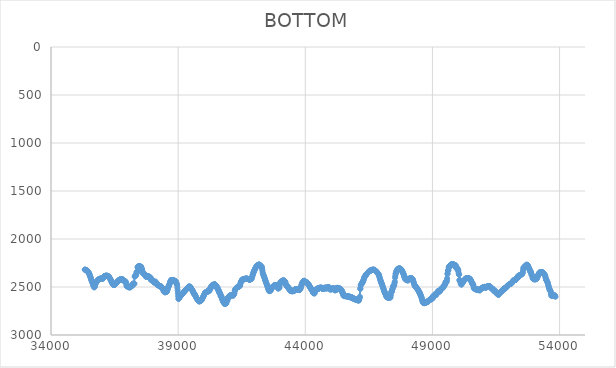
| Category | BOTTOM |
|---|---|
| 35327.6569 | 2318.68 |
| 35334.7907 | 2319.68 |
| 35345.0303 | 2320.68 |
| 35355.2703 | 2321.69 |
| 35365.5104 | 2322.69 |
| 35375.7505 | 2323.7 |
| 35385.9906 | 2324.7 |
| 35396.2307 | 2325.72 |
| 35406.4708 | 2327.69 |
| 35416.7108 | 2329.66 |
| 35426.9509 | 2331.63 |
| 35437.191 | 2333.6 |
| 35447.4311 | 2335.6 |
| 35457.6712 | 2340.18 |
| 35467.9113 | 2344.75 |
| 35478.1514 | 2349.33 |
| 35488.3914 | 2353.92 |
| 35498.6315 | 2360.02 |
| 35508.8716 | 2366.12 |
| 35519.1117 | 2372.23 |
| 35529.3518 | 2379.98 |
| 35539.5919 | 2387.72 |
| 35549.8319 | 2395.46 |
| 35560.072 | 2403.22 |
| 35570.3121 | 2412.37 |
| 35580.5522 | 2421.5 |
| 35590.7923 | 2429.24 |
| 35601.0324 | 2436.97 |
| 35611.2724 | 2443.3 |
| 35621.5125 | 2449.64 |
| 35631.7526 | 2455.97 |
| 35641.9927 | 2462.35 |
| 35652.2328 | 2472.2 |
| 35662.4729 | 2482.02 |
| 35672.713 | 2489.06 |
| 35682.953 | 2496.07 |
| 35693.1931 | 2500.29 |
| 35703.4332 | 2504.4 |
| 35713.6733 | 2498.77 |
| 35723.9134 | 2493.1 |
| 35734.1535 | 2483.18 |
| 35744.3935 | 2467.81 |
| 35754.6336 | 2462.17 |
| 35764.8737 | 2456.59 |
| 35775.1138 | 2455.12 |
| 35785.3539 | 2448.1 |
| 35795.594 | 2442.49 |
| 35805.8341 | 2439.21 |
| 35816.0741 | 2435.92 |
| 35826.3142 | 2432.65 |
| 35836.5543 | 2429.83 |
| 35846.7944 | 2427.02 |
| 35857.0345 | 2424.21 |
| 35867.2746 | 2422.33 |
| 35877.5146 | 2420.46 |
| 35887.7547 | 2418.59 |
| 35897.9948 | 2417.89 |
| 35908.2349 | 2417.19 |
| 35918.475 | 2416.48 |
| 35928.7151 | 2415.76 |
| 35938.9552 | 2413.89 |
| 35949.1952 | 2412.01 |
| 35959.4353 | 2410.17 |
| 35969.6754 | 2411.1 |
| 35979.9155 | 2412.04 |
| 35990.1556 | 2412.97 |
| 36000.3957 | 2412.97 |
| 36010.6357 | 2412.97 |
| 36020.8758 | 2412.97 |
| 36031.1159 | 2412.97 |
| 36041.356 | 2412.89 |
| 36051.5961 | 2405.85 |
| 36061.8362 | 2398.86 |
| 36072.0763 | 2396.05 |
| 36082.3163 | 2393.23 |
| 36092.5564 | 2390.42 |
| 36102.7965 | 2387.6 |
| 36113.0366 | 2384.81 |
| 36123.2767 | 2384.46 |
| 36133.5168 | 2384.11 |
| 36143.7568 | 2383.76 |
| 36153.9969 | 2383.41 |
| 36164.237 | 2382.94 |
| 36174.4771 | 2382.47 |
| 36184.7172 | 2382.01 |
| 36194.9573 | 2382.72 |
| 36205.1974 | 2383.42 |
| 36215.4374 | 2384.12 |
| 36225.6775 | 2384.84 |
| 36235.9176 | 2386.53 |
| 36246.1577 | 2388.22 |
| 36256.3978 | 2389.91 |
| 36266.6379 | 2391.59 |
| 36276.8779 | 2393.32 |
| 36287.118 | 2397.82 |
| 36297.3581 | 2402.33 |
| 36307.5982 | 2406.83 |
| 36317.8383 | 2411.33 |
| 36328.0784 | 2415.85 |
| 36338.3185 | 2421.48 |
| 36348.5585 | 2427.11 |
| 36358.7986 | 2432.74 |
| 36369.0387 | 2438.37 |
| 36379.2788 | 2444.01 |
| 36389.5189 | 2449.64 |
| 36399.759 | 2455.25 |
| 36409.999 | 2459.83 |
| 36420.2391 | 2464.4 |
| 36430.4792 | 2468.98 |
| 36440.7193 | 2473.52 |
| 36450.9594 | 2475.28 |
| 36461.1995 | 2477.04 |
| 36471.4396 | 2478.8 |
| 36481.6796 | 2480.5 |
| 36491.9197 | 2477.69 |
| 36502.1598 | 2474.87 |
| 36512.3999 | 2472.06 |
| 36522.64 | 2469.25 |
| 36532.8801 | 2466.9 |
| 36543.1201 | 2464.55 |
| 36553.3602 | 2462.2 |
| 36563.6003 | 2458.91 |
| 36573.8404 | 2455.63 |
| 36584.0805 | 2452.36 |
| 36594.3206 | 2450.48 |
| 36604.5607 | 2448.61 |
| 36614.8007 | 2446.69 |
| 36625.0408 | 2441.77 |
| 36635.2809 | 2436.87 |
| 36645.521 | 2434.76 |
| 36655.7611 | 2432.65 |
| 36666.0012 | 2430.54 |
| 36676.2412 | 2428.44 |
| 36686.4813 | 2427.03 |
| 36696.7214 | 2425.62 |
| 36706.9615 | 2423.74 |
| 36717.2016 | 2421.86 |
| 36727.4417 | 2420.01 |
| 36737.6818 | 2420.01 |
| 36747.9218 | 2420.01 |
| 36758.1619 | 2420.01 |
| 36768.402 | 2420.01 |
| 36778.6421 | 2420.01 |
| 36788.8822 | 2420.37 |
| 36799.1223 | 2420.72 |
| 36809.3623 | 2421.07 |
| 36819.6024 | 2421.46 |
| 36829.8425 | 2424.62 |
| 36840.0826 | 2427.79 |
| 36850.3227 | 2430.96 |
| 36860.5628 | 2434.1 |
| 36870.8029 | 2435.04 |
| 36881.0429 | 2435.97 |
| 36891.283 | 2436.92 |
| 36901.5231 | 2438.8 |
| 36911.7632 | 2440.68 |
| 36922.0033 | 2442.57 |
| 36932.2434 | 2445.38 |
| 36942.4834 | 2448.3 |
| 36952.7235 | 2459.56 |
| 36962.9636 | 2470.93 |
| 36973.2037 | 2490.4 |
| 36983.4438 | 2490.86 |
| 36993.6839 | 2491.33 |
| 37003.924 | 2491.83 |
| 37014.164 | 2494.65 |
| 37024.4041 | 2497.44 |
| 37034.6442 | 2498.38 |
| 37044.8843 | 2499.32 |
| 37055.1244 | 2500.26 |
| 37065.3645 | 2501.67 |
| 37075.6045 | 2503.08 |
| 37085.8446 | 2504.44 |
| 37096.0847 | 2502.57 |
| 37106.3248 | 2500.69 |
| 37116.5649 | 2498.89 |
| 37126.805 | 2502.91 |
| 37137.0451 | 2491.8 |
| 37147.2851 | 2491.8 |
| 37157.5252 | 2491.73 |
| 37167.7653 | 2486.18 |
| 37178.0054 | 2487.52 |
| 37188.2455 | 2483.33 |
| 37198.4856 | 2482 |
| 37208.7256 | 2485.95 |
| 37218.9657 | 2469.24 |
| 37229.2058 | 2466.42 |
| 37239.4459 | 2463.66 |
| 37249.686 | 2465.05 |
| 37259.9261 | 2465.05 |
| 37270.1662 | 2465.07 |
| 37280.4062 | 2465.5 |
| 37290.6463 | 2391.78 |
| 37300.8864 | 2386.21 |
| 37311.1265 | 2384.8 |
| 37321.3666 | 2383.36 |
| 37331.6067 | 2379.11 |
| 37341.8467 | 2373.54 |
| 37352.0868 | 2371.84 |
| 37362.3269 | 2348.17 |
| 37372.567 | 2344.02 |
| 37382.8071 | 2345.35 |
| 37393.0472 | 2340.56 |
| 37403.2873 | 2293.3 |
| 37413.5273 | 2291.86 |
| 37423.7674 | 2287.67 |
| 37434.0075 | 2286.27 |
| 37444.2476 | 2284.88 |
| 37454.4877 | 2284.9 |
| 37464.7278 | 2286.27 |
| 37474.9678 | 2284.86 |
| 37485.2079 | 2283.49 |
| 37495.448 | 2284.88 |
| 37505.6881 | 2284.93 |
| 37515.9282 | 2289.1 |
| 37526.1683 | 2289.12 |
| 37536.4084 | 2290.51 |
| 37546.6484 | 2290.68 |
| 37556.8885 | 2303.34 |
| 37567.1286 | 2315.77 |
| 37577.3687 | 2310.59 |
| 37587.6088 | 2338.37 |
| 37597.8489 | 2338.59 |
| 37608.0889 | 2355.26 |
| 37618.329 | 2355.31 |
| 37628.5691 | 2359.48 |
| 37638.8092 | 2359.52 |
| 37649.0493 | 2362.3 |
| 37659.2894 | 2362.32 |
| 37669.5295 | 2363.76 |
| 37679.7695 | 2368 |
| 37690.0096 | 2373.5 |
| 37700.2497 | 2369.5 |
| 37710.4898 | 2382.1 |
| 37720.7299 | 2389.04 |
| 37730.97 | 2389.12 |
| 37741.21 | 2394.6 |
| 37751.4501 | 2389.06 |
| 37761.6902 | 2390.47 |
| 37771.9303 | 2391.82 |
| 37782.1704 | 2389.06 |
| 37792.4105 | 2390.39 |
| 37802.6506 | 2386.23 |
| 37812.8906 | 2386.28 |
| 37823.1307 | 2390.43 |
| 37833.3708 | 2389.08 |
| 37843.6109 | 2391.84 |
| 37853.851 | 2390.49 |
| 37864.0911 | 2393.34 |
| 37874.3311 | 2398.91 |
| 37884.5712 | 2400.3 |
| 37894.8113 | 2400.3 |
| 37905.0514 | 2400.34 |
| 37915.2915 | 2403.41 |
| 37925.5316 | 2424.25 |
| 37935.7717 | 2425.66 |
| 37946.0117 | 2426.97 |
| 37956.2518 | 2421.47 |
| 37966.4919 | 2425.68 |
| 37976.732 | 2428.53 |
| 37986.9721 | 2434.16 |
| 37997.2122 | 2439.75 |
| 38007.4523 | 2442.45 |
| 38017.6923 | 2436.94 |
| 38027.9324 | 2439.79 |
| 38038.1725 | 2445.35 |
| 38048.4126 | 2445.42 |
| 38058.6527 | 2451.05 |
| 38068.8928 | 2456.55 |
| 38079.1328 | 2452.33 |
| 38089.3729 | 2448.16 |
| 38099.613 | 2448.08 |
| 38109.8531 | 2442.69 |
| 38120.0932 | 2453.87 |
| 38130.3333 | 2459.46 |
| 38140.5734 | 2462.32 |
| 38150.8134 | 2467.95 |
| 38161.0535 | 2473.48 |
| 38171.2936 | 2472.13 |
| 38181.5337 | 2474.91 |
| 38191.7738 | 2474.95 |
| 38202.0139 | 2477.68 |
| 38212.2539 | 2474.98 |
| 38222.494 | 2480.56 |
| 38232.7341 | 2482 |
| 38242.9742 | 2486.23 |
| 38253.2143 | 2490.39 |
| 38263.4544 | 2490.39 |
| 38273.6945 | 2490.43 |
| 38283.9345 | 2493.2 |
| 38294.1746 | 2493.18 |
| 38304.4147 | 2491.82 |
| 38314.6548 | 2493.22 |
| 38324.8949 | 2494.61 |
| 38335.135 | 2494.67 |
| 38345.375 | 2498.92 |
| 38355.6151 | 2504.53 |
| 38365.8552 | 2508.77 |
| 38376.0953 | 2514.4 |
| 38386.3354 | 2519.91 |
| 38396.5755 | 2517.13 |
| 38406.8156 | 2517.21 |
| 38417.0556 | 2523.09 |
| 38427.2957 | 2545.21 |
| 38437.5358 | 2539.6 |
| 38447.7759 | 2535.45 |
| 38458.016 | 2536.9 |
| 38468.2561 | 2541.27 |
| 38478.4962 | 2555.14 |
| 38488.7362 | 2555.12 |
| 38498.9763 | 2553.72 |
| 38509.2164 | 2552.54 |
| 38519.4565 | 2551.37 |
| 38529.6966 | 2550.2 |
| 38539.9367 | 2549.02 |
| 38550.1767 | 2547.85 |
| 38560.4168 | 2546.56 |
| 38570.6569 | 2537.27 |
| 38580.897 | 2527.98 |
| 38591.1371 | 2518.69 |
| 38601.3772 | 2509.4 |
| 38611.6173 | 2500.16 |
| 38621.8573 | 2494.17 |
| 38632.0974 | 2488.19 |
| 38642.3375 | 2482.21 |
| 38652.5776 | 2476.2 |
| 38662.8177 | 2468.22 |
| 38673.0578 | 2460.24 |
| 38683.2978 | 2452.27 |
| 38693.5379 | 2444.29 |
| 38703.778 | 2436.31 |
| 38714.0181 | 2428.45 |
| 38724.2582 | 2428.45 |
| 38734.4983 | 2428.45 |
| 38744.7384 | 2428.45 |
| 38754.9784 | 2428.45 |
| 38765.2185 | 2428.45 |
| 38775.4586 | 2428.45 |
| 38785.6987 | 2428.45 |
| 38795.9388 | 2428.45 |
| 38806.1789 | 2428.45 |
| 38816.4189 | 2428.48 |
| 38826.659 | 2430.04 |
| 38836.8991 | 2431.61 |
| 38847.1392 | 2433.17 |
| 38857.3793 | 2434.73 |
| 38867.6194 | 2436.3 |
| 38877.8595 | 2437.86 |
| 38888.0995 | 2439.43 |
| 38898.3396 | 2440.99 |
| 38908.5797 | 2442.64 |
| 38918.8198 | 2449.96 |
| 38929.0599 | 2457.28 |
| 38939.3 | 2464.6 |
| 38949.5401 | 2471.92 |
| 38959.7801 | 2479.55 |
| 38970.0202 | 2507.7 |
| 38980.2603 | 2535.87 |
| 38990.5004 | 2564.96 |
| 39000.7405 | 2594.05 |
| 39010.9806 | 2622.73 |
| 39021.2206 | 2624.01 |
| 39031.4607 | 2617.01 |
| 39041.7008 | 2612.99 |
| 39051.9409 | 2608.97 |
| 39062.181 | 2604.95 |
| 39072.4211 | 2600.93 |
| 39082.6612 | 2596.91 |
| 39092.9012 | 2592.88 |
| 39103.1413 | 2588.88 |
| 39113.3814 | 2586.38 |
| 39123.6215 | 2583.88 |
| 39133.8616 | 2581.38 |
| 39144.1017 | 2578.88 |
| 39154.3417 | 2576.37 |
| 39164.5818 | 2573.87 |
| 39174.8219 | 2571.37 |
| 39185.062 | 2568.87 |
| 39195.3021 | 2566.32 |
| 39205.5422 | 2561.16 |
| 39215.7823 | 2556 |
| 39226.0223 | 2550.87 |
| 39236.2624 | 2548.06 |
| 39246.5025 | 2545.24 |
| 39256.7426 | 2542.43 |
| 39266.9827 | 2539.61 |
| 39277.2228 | 2536.8 |
| 39287.4629 | 2533.98 |
| 39297.7029 | 2531.17 |
| 39307.943 | 2528.35 |
| 39318.1831 | 2525.3 |
| 39328.4232 | 2522.25 |
| 39338.6633 | 2519.2 |
| 39348.9034 | 2516.15 |
| 39359.1434 | 2513.1 |
| 39369.3835 | 2510.05 |
| 39379.6236 | 2507.24 |
| 39389.8637 | 2504.42 |
| 39400.1038 | 2501.61 |
| 39410.3439 | 2498.79 |
| 39420.584 | 2496.02 |
| 39430.824 | 2496.02 |
| 39441.0641 | 2496.02 |
| 39451.3042 | 2496.02 |
| 39461.5443 | 2496.08 |
| 39471.7844 | 2499.95 |
| 39482.0245 | 2503.82 |
| 39492.2645 | 2507.69 |
| 39502.5046 | 2511.57 |
| 39512.7447 | 2515.55 |
| 39522.9848 | 2519.54 |
| 39533.2249 | 2523.53 |
| 39543.465 | 2527.52 |
| 39553.7051 | 2531.51 |
| 39563.9451 | 2535.53 |
| 39574.1852 | 2541.63 |
| 39584.4253 | 2547.73 |
| 39594.6654 | 2553.83 |
| 39604.9055 | 2559.93 |
| 39615.1456 | 2566.03 |
| 39625.3857 | 2572.08 |
| 39635.6257 | 2574.89 |
| 39645.8658 | 2577.71 |
| 39656.1059 | 2580.52 |
| 39666.346 | 2583.39 |
| 39676.5861 | 2589.3 |
| 39686.8262 | 2595.21 |
| 39697.0662 | 2601.12 |
| 39707.3063 | 2607.03 |
| 39717.5464 | 2612.92 |
| 39727.7865 | 2616.9 |
| 39738.0266 | 2620.89 |
| 39748.2667 | 2624.88 |
| 39758.5068 | 2628.87 |
| 39768.7468 | 2632.86 |
| 39778.9869 | 2636.83 |
| 39789.227 | 2639.64 |
| 39799.4671 | 2642.46 |
| 39809.7072 | 2645.27 |
| 39819.9473 | 2648.09 |
| 39830.1874 | 2650.84 |
| 39840.4274 | 2649.43 |
| 39850.6675 | 2648.02 |
| 39860.9076 | 2646.61 |
| 39871.1477 | 2645.2 |
| 39881.3878 | 2643.8 |
| 39891.6279 | 2642.39 |
| 39901.8679 | 2640.97 |
| 39912.108 | 2638.86 |
| 39922.3481 | 2636.69 |
| 39932.5882 | 2630.7 |
| 39942.8283 | 2624.72 |
| 39953.0684 | 2618.74 |
| 39963.3085 | 2612.77 |
| 39973.5485 | 2607.49 |
| 39983.7886 | 2602.21 |
| 39994.0287 | 2596.93 |
| 40004.2688 | 2591.64 |
| 40014.5089 | 2585.73 |
| 40024.749 | 2579.82 |
| 40034.989 | 2573.91 |
| 40045.2291 | 2567.99 |
| 40055.4692 | 2562.14 |
| 40065.7093 | 2559.89 |
| 40075.9494 | 2557.64 |
| 40086.1895 | 2555.38 |
| 40096.4296 | 2553.13 |
| 40106.6696 | 2550.96 |
| 40116.9097 | 2553.69 |
| 40127.1498 | 2550.87 |
| 40137.3899 | 2548.03 |
| 40147.63 | 2543.86 |
| 40157.8701 | 2542.54 |
| 40168.1102 | 2546.72 |
| 40178.3502 | 2548.03 |
| 40188.5903 | 2543.83 |
| 40198.8304 | 2540.99 |
| 40209.0705 | 2536.89 |
| 40219.3106 | 2539.66 |
| 40229.5507 | 2539.38 |
| 40239.7907 | 2522.76 |
| 40250.0308 | 2522.7 |
| 40260.2709 | 2518.5 |
| 40270.511 | 2515.54 |
| 40280.7511 | 2504.4 |
| 40290.9912 | 2500.17 |
| 40301.2313 | 2496.09 |
| 40311.4713 | 2499.99 |
| 40321.7114 | 2484.83 |
| 40331.9515 | 2488.91 |
| 40342.1916 | 2484.74 |
| 40352.4317 | 2483.3 |
| 40362.6718 | 2480.47 |
| 40372.9119 | 2476.34 |
| 40383.1519 | 2477.67 |
| 40393.392 | 2474.93 |
| 40403.6321 | 2476.31 |
| 40413.8722 | 2476.24 |
| 40424.1123 | 2472.09 |
| 40434.3524 | 2472.11 |
| 40444.5924 | 2473.55 |
| 40454.8325 | 2476.31 |
| 40465.0726 | 2476.52 |
| 40475.3127 | 2488.91 |
| 40485.5528 | 2484.83 |
| 40495.7929 | 2489.05 |
| 40506.033 | 2493.44 |
| 40516.273 | 2507.23 |
| 40526.5131 | 2504.42 |
| 40536.7532 | 2501.72 |
| 40546.9933 | 2506.11 |
| 40557.2334 | 2520.02 |
| 40567.4735 | 2524.2 |
| 40577.7136 | 2525.86 |
| 40587.9536 | 2542.4 |
| 40598.1937 | 2538.32 |
| 40608.4338 | 2542.8 |
| 40618.6739 | 2562.11 |
| 40628.914 | 2558.03 |
| 40639.1541 | 2562.32 |
| 40649.3941 | 2570.67 |
| 40659.6342 | 2573.8 |
| 40669.8743 | 2594.48 |
| 40680.1144 | 2590.35 |
| 40690.3545 | 2591.86 |
| 40700.5946 | 2598.85 |
| 40710.8347 | 2603.24 |
| 40721.0747 | 2617.12 |
| 40731.3148 | 2620.15 |
| 40741.5549 | 2635.42 |
| 40751.795 | 2638.45 |
| 40762.0351 | 2653.67 |
| 40772.2752 | 2653.67 |
| 40782.5153 | 2653.79 |
| 40792.7553 | 2660.71 |
| 40802.9954 | 2660.71 |
| 40813.2355 | 2660.98 |
| 40823.4756 | 2676.15 |
| 40833.7157 | 2673.38 |
| 40843.9558 | 2673.38 |
| 40854.1958 | 2673.33 |
| 40864.4359 | 2670.49 |
| 40874.676 | 2666.41 |
| 40884.9161 | 2670.56 |
| 40895.1562 | 2670.13 |
| 40905.3963 | 2645.23 |
| 40915.6364 | 2645.18 |
| 40925.8764 | 2642.44 |
| 40936.1165 | 2643.36 |
| 40946.3566 | 2617 |
| 40956.5967 | 2612.78 |
| 40966.8368 | 2608.7 |
| 40977.0769 | 2612.83 |
| 40987.317 | 2611.4 |
| 40997.557 | 2608.39 |
| 41007.7971 | 2594.55 |
| 41018.0372 | 2594.48 |
| 41028.2773 | 2590.31 |
| 41038.5174 | 2588.97 |
| 41048.7575 | 2591.69 |
| 41058.9975 | 2588.87 |
| 41069.2376 | 2586.11 |
| 41079.4777 | 2586.11 |
| 41089.7178 | 2586.11 |
| 41099.9579 | 2586.11 |
| 41110.198 | 2586.08 |
| 41120.4381 | 2584.7 |
| 41130.6781 | 2584.7 |
| 41140.9182 | 2584.75 |
| 41151.1583 | 2587.59 |
| 41161.3984 | 2591.57 |
| 41171.6385 | 2581.81 |
| 41181.8786 | 2577.66 |
| 41192.1187 | 2577.54 |
| 41202.3587 | 2570.55 |
| 41212.5988 | 2565.98 |
| 41222.8389 | 2542.4 |
| 41233.079 | 2538 |
| 41243.3191 | 2524.15 |
| 41253.5592 | 2522.69 |
| 41263.7992 | 2518.54 |
| 41274.0393 | 2518.44 |
| 41284.2794 | 2512.86 |
| 41294.5195 | 2510.02 |
| 41304.7596 | 2505.85 |
| 41314.9997 | 2504.44 |
| 41325.2398 | 2503.01 |
| 41335.4798 | 2500.22 |
| 41345.7199 | 2498.81 |
| 41355.96 | 2497.45 |
| 41366.2001 | 2498.81 |
| 41376.4402 | 2497.4 |
| 41386.6803 | 2496.02 |
| 41396.9204 | 2495.94 |
| 41407.1604 | 2491.72 |
| 41417.4005 | 2487.5 |
| 41427.6406 | 2483.43 |
| 41437.8807 | 2487.12 |
| 41448.1208 | 2462.19 |
| 41458.3609 | 2459.17 |
| 41468.601 | 2445.27 |
| 41478.841 | 2441.07 |
| 41489.0811 | 2438.23 |
| 41499.3212 | 2433.96 |
| 41509.5613 | 2426.97 |
| 41519.8014 | 2422.85 |
| 41530.0415 | 2424.21 |
| 41540.2815 | 2422.77 |
| 41550.5216 | 2420.03 |
| 41560.7617 | 2421.42 |
| 41571.0018 | 2421.37 |
| 41581.2419 | 2418.6 |
| 41591.482 | 2418.6 |
| 41601.7221 | 2418.6 |
| 41611.9621 | 2418.52 |
| 41622.2022 | 2414.37 |
| 41632.4423 | 2414.17 |
| 41642.6824 | 2413.97 |
| 41652.9225 | 2413.77 |
| 41663.1626 | 2413.57 |
| 41673.4027 | 2413.37 |
| 41683.6427 | 2413.17 |
| 41693.8828 | 2412.98 |
| 41704.1229 | 2413.58 |
| 41714.363 | 2414.19 |
| 41724.6031 | 2414.79 |
| 41734.8432 | 2415.39 |
| 41745.0832 | 2416 |
| 41755.3233 | 2416.6 |
| 41765.5634 | 2417.23 |
| 41775.8035 | 2418.99 |
| 41786.0436 | 2420.74 |
| 41796.2837 | 2422.5 |
| 41806.5238 | 2424.21 |
| 41816.7638 | 2423.16 |
| 41827.0039 | 2422.1 |
| 41837.244 | 2421.05 |
| 41847.4841 | 2419.98 |
| 41857.7242 | 2418.22 |
| 41867.9643 | 2416.46 |
| 41878.2044 | 2414.7 |
| 41888.4444 | 2412.83 |
| 41898.6845 | 2405.09 |
| 41908.9246 | 2397.25 |
| 41919.1647 | 2384.67 |
| 41929.4048 | 2376.5 |
| 41939.6449 | 2368.34 |
| 41949.8849 | 2360.18 |
| 41960.125 | 2352.01 |
| 41970.3651 | 2343.89 |
| 41980.6052 | 2337.9 |
| 41990.8453 | 2331.92 |
| 42001.0854 | 2325.94 |
| 42011.3255 | 2319.96 |
| 42021.5655 | 2314.33 |
| 42031.8056 | 2308.7 |
| 42042.0457 | 2303.07 |
| 42052.2858 | 2297.44 |
| 42062.5259 | 2291.84 |
| 42072.766 | 2287.97 |
| 42083.0061 | 2284.1 |
| 42093.2461 | 2280.23 |
| 42103.4862 | 2276.41 |
| 42113.7263 | 2275 |
| 42123.9664 | 2273.59 |
| 42134.2065 | 2272.18 |
| 42144.4466 | 2270.78 |
| 42154.6867 | 2269.37 |
| 42164.9267 | 2267.96 |
| 42175.1668 | 2266.55 |
| 42185.4069 | 2265.22 |
| 42195.647 | 2267.75 |
| 42205.8871 | 2270.29 |
| 42216.1272 | 2272.82 |
| 42226.3672 | 2275.35 |
| 42236.6073 | 2277.89 |
| 42246.8474 | 2280.42 |
| 42257.0875 | 2282.95 |
| 42267.3276 | 2285.49 |
| 42277.5677 | 2288.02 |
| 42287.8078 | 2290.76 |
| 42298.0478 | 2304.13 |
| 42308.2879 | 2317.62 |
| 42318.528 | 2337.33 |
| 42328.7681 | 2356.8 |
| 42339.0082 | 2364.04 |
| 42349.2483 | 2371.28 |
| 42359.4884 | 2378.52 |
| 42369.7284 | 2385.76 |
| 42379.9685 | 2393 |
| 42390.2086 | 2400.24 |
| 42400.4487 | 2407.5 |
| 42410.6888 | 2415.95 |
| 42420.9289 | 2424.39 |
| 42431.169 | 2432.84 |
| 42441.409 | 2441.26 |
| 42451.6491 | 2448.3 |
| 42461.8892 | 2455.33 |
| 42472.1293 | 2462.37 |
| 42482.3694 | 2469.43 |
| 42492.6095 | 2477.52 |
| 42502.8495 | 2485.62 |
| 42513.0896 | 2493.71 |
| 42523.3297 | 2501.81 |
| 42533.5698 | 2509.9 |
| 42543.8099 | 2517.99 |
| 42554.05 | 2526.09 |
| 42564.2901 | 2534.13 |
| 42574.5301 | 2539.71 |
| 42584.7702 | 2542.47 |
| 42595.0103 | 2542.44 |
| 42605.2504 | 2541.06 |
| 42615.4905 | 2540.87 |
| 42625.7306 | 2531.21 |
| 42635.9707 | 2531.29 |
| 42646.2107 | 2535.08 |
| 42656.4508 | 2517.13 |
| 42666.6909 | 2517.08 |
| 42676.931 | 2514.07 |
| 42687.1711 | 2501.68 |
| 42697.4112 | 2503.03 |
| 42707.6513 | 2501.57 |
| 42717.8913 | 2497.43 |
| 42728.1314 | 2497.35 |
| 42738.3715 | 2493.29 |
| 42748.6116 | 2497.21 |
| 42758.8517 | 2486.17 |
| 42769.0918 | 2486.14 |
| 42779.3318 | 2484.7 |
| 42789.5719 | 2482.03 |
| 42799.812 | 2486.08 |
| 42810.0521 | 2481.92 |
| 42820.2922 | 2480.51 |
| 42830.5323 | 2479.16 |
| 42840.7724 | 2480.54 |
| 42851.0124 | 2480.54 |
| 42861.2525 | 2480.59 |
| 42871.4926 | 2483.43 |
| 42881.7327 | 2487.6 |
| 42891.9728 | 2489.04 |
| 42902.2129 | 2492.05 |
| 42912.453 | 2504.55 |
| 42922.693 | 2508.8 |
| 42932.9331 | 2514.37 |
| 42943.1732 | 2517.02 |
| 42953.4133 | 2511.39 |
| 42963.6534 | 2505.79 |
| 42973.8935 | 2501.76 |
| 42984.1336 | 2506.76 |
| 42994.3736 | 2480.15 |
| 43004.6137 | 2460.72 |
| 43014.8538 | 2455.12 |
| 43025.0939 | 2450.98 |
| 43035.334 | 2450.92 |
| 43045.5741 | 2448.08 |
| 43055.8141 | 2443.91 |
| 43066.0542 | 2442.5 |
| 43076.2943 | 2441.07 |
| 43086.5344 | 2438.22 |
| 43096.7745 | 2434.2 |
| 43107.0146 | 2439.77 |
| 43117.2547 | 2442.42 |
| 43127.4947 | 2436.79 |
| 43137.7348 | 2431.21 |
| 43147.9749 | 2428.57 |
| 43158.215 | 2434.17 |
| 43168.4551 | 2438.34 |
| 43178.6952 | 2439.74 |
| 43188.9353 | 2441.21 |
| 43199.1753 | 2445.35 |
| 43209.4154 | 2445.4 |
| 43219.6555 | 2448.69 |
| 43229.8956 | 2474.79 |
| 43240.1357 | 2469.39 |
| 43250.3758 | 2475.1 |
| 43260.6159 | 2484.79 |
| 43270.8559 | 2486.22 |
| 43281.096 | 2489.18 |
| 43291.3361 | 2498.81 |
| 43301.5762 | 2497.43 |
| 43311.8163 | 2497.51 |
| 43322.0564 | 2501.79 |
| 43332.2964 | 2508.72 |
| 43342.5365 | 2510.1 |
| 43352.7766 | 2510.21 |
| 43363.0167 | 2515.92 |
| 43373.2568 | 2525.69 |
| 43383.4969 | 2531.21 |
| 43393.737 | 2531.35 |
| 43403.977 | 2538.14 |
| 43414.2171 | 2532.79 |
| 43424.4572 | 2541.04 |
| 43434.6973 | 2539.71 |
| 43444.9374 | 2542.44 |
| 43455.1775 | 2541.06 |
| 43465.4176 | 2541.09 |
| 43475.6576 | 2542.56 |
| 43485.8977 | 2546.64 |
| 43496.1378 | 2543.85 |
| 43506.3779 | 2542.47 |
| 43516.618 | 2542.36 |
| 43526.8581 | 2536.81 |
| 43537.0982 | 2535.49 |
| 43547.3382 | 2538.36 |
| 43557.5783 | 2543.62 |
| 43567.8184 | 2531.21 |
| 43578.0585 | 2531.12 |
| 43588.2986 | 2526.96 |
| 43598.5387 | 2525.55 |
| 43608.7788 | 2524.17 |
| 43619.0188 | 2524.17 |
| 43629.2589 | 2524.14 |
| 43639.499 | 2522.76 |
| 43649.7391 | 2522.79 |
| 43659.9792 | 2524.17 |
| 43670.2193 | 2524.14 |
| 43680.4593 | 2522.79 |
| 43690.6994 | 2524.11 |
| 43700.9395 | 2521.41 |
| 43711.1796 | 2524.23 |
| 43721.4197 | 2526.96 |
| 43731.6598 | 2525.55 |
| 43741.8999 | 2524.29 |
| 43752.1399 | 2529.86 |
| 43762.38 | 2532.56 |
| 43772.6201 | 2529.73 |
| 43782.8602 | 2526.21 |
| 43793.1003 | 2522.69 |
| 43803.3404 | 2519.17 |
| 43813.5805 | 2515.52 |
| 43823.8205 | 2505.67 |
| 43834.0606 | 2495.82 |
| 43844.3007 | 2485.96 |
| 43854.5408 | 2476.18 |
| 43864.7809 | 2469.49 |
| 43875.021 | 2462.8 |
| 43885.2611 | 2456.12 |
| 43895.5011 | 2449.52 |
| 43905.7412 | 2446.93 |
| 43915.9813 | 2444.35 |
| 43926.2214 | 2441.77 |
| 43936.4615 | 2439.19 |
| 43946.7016 | 2436.61 |
| 43956.9417 | 2434.13 |
| 43967.1817 | 2436.48 |
| 43977.4218 | 2438.83 |
| 43987.6619 | 2441.17 |
| 43997.902 | 2443.52 |
| 44008.1421 | 2445.86 |
| 44018.3822 | 2448.19 |
| 44028.6222 | 2449.6 |
| 44038.8623 | 2451.01 |
| 44049.1024 | 2452.41 |
| 44059.3425 | 2453.82 |
| 44069.5826 | 2455.25 |
| 44079.8227 | 2457.79 |
| 44090.0628 | 2460.32 |
| 44100.3028 | 2462.85 |
| 44110.5429 | 2465.39 |
| 44120.783 | 2467.99 |
| 44131.0231 | 2473.62 |
| 44141.2632 | 2479.25 |
| 44151.5033 | 2484.88 |
| 44161.7434 | 2490.48 |
| 44171.9834 | 2494.7 |
| 44182.2235 | 2498.92 |
| 44192.4636 | 2503.15 |
| 44202.7037 | 2507.37 |
| 44212.9438 | 2511.74 |
| 44223.1839 | 2522.65 |
| 44233.424 | 2517.34 |
| 44243.664 | 2526.9 |
| 44253.9041 | 2522.91 |
| 44264.1442 | 2529.89 |
| 44274.3843 | 2533.88 |
| 44284.6244 | 2527.55 |
| 44294.8645 | 2553.85 |
| 44305.1046 | 2559.39 |
| 44315.3446 | 2560.8 |
| 44325.5847 | 2562.21 |
| 44335.8248 | 2563.65 |
| 44346.0649 | 2566.4 |
| 44356.305 | 2566.4 |
| 44366.5451 | 2565.95 |
| 44376.7852 | 2545.26 |
| 44387.0252 | 2543.85 |
| 44397.2653 | 2542.38 |
| 44407.5054 | 2538.16 |
| 44417.7455 | 2534 |
| 44427.9856 | 2532.56 |
| 44438.2257 | 2529.68 |
| 44448.4657 | 2524.11 |
| 44458.7058 | 2521.3 |
| 44468.9459 | 2518.48 |
| 44479.186 | 2515.73 |
| 44489.4261 | 2515.7 |
| 44499.6662 | 2514.35 |
| 44509.9063 | 2515.76 |
| 44520.1463 | 2517.13 |
| 44530.3864 | 2517.1 |
| 44540.6265 | 2515.67 |
| 44550.8666 | 2512.88 |
| 44561.1067 | 2511.44 |
| 44571.3468 | 2508.69 |
| 44581.5869 | 2508.6 |
| 44591.8269 | 2504.59 |
| 44602.067 | 2510.07 |
| 44612.3071 | 2508.63 |
| 44622.5472 | 2505.93 |
| 44632.7873 | 2508.69 |
| 44643.0274 | 2508.69 |
| 44653.2675 | 2508.72 |
| 44663.5075 | 2510.31 |
| 44673.7476 | 2519.95 |
| 44683.9877 | 2519.95 |
| 44694.2278 | 2519.95 |
| 44704.4679 | 2519.92 |
| 44714.708 | 2518.54 |
| 44724.9481 | 2518.54 |
| 44735.1881 | 2518.45 |
| 44745.4282 | 2514.17 |
| 44755.6683 | 2507.28 |
| 44765.9084 | 2507.31 |
| 44776.1485 | 2508.69 |
| 44786.3886 | 2508.69 |
| 44796.6287 | 2508.69 |
| 44806.8687 | 2508.78 |
| 44817.1088 | 2512.97 |
| 44827.3489 | 2515.76 |
| 44837.589 | 2516.86 |
| 44847.8291 | 2504.47 |
| 44858.0692 | 2504.5 |
| 44868.3092 | 2505.93 |
| 44878.5493 | 2508.53 |
| 44888.7894 | 2501.62 |
| 44899.0295 | 2500.27 |
| 44909.2696 | 2501.68 |
| 44919.5097 | 2503.06 |
| 44929.7498 | 2503.12 |
| 44939.9898 | 2505.9 |
| 44950.2299 | 2507.31 |
| 44960.47 | 2508.78 |
| 44970.7101 | 2513.25 |
| 44980.9502 | 2528.27 |
| 44991.1903 | 2522.73 |
| 45001.4304 | 2521.39 |
| 45011.6704 | 2522.76 |
| 45021.9105 | 2522.76 |
| 45032.1506 | 2522.8 |
| 45042.3907 | 2524.08 |
| 45052.6308 | 2519.86 |
| 45062.8709 | 2515.73 |
| 45073.111 | 2515.76 |
| 45083.351 | 2517.13 |
| 45093.5911 | 2517.07 |
| 45103.8312 | 2514.35 |
| 45114.0713 | 2515.76 |
| 45124.3114 | 2517.17 |
| 45134.5515 | 2518.54 |
| 45144.7916 | 2518.89 |
| 45155.0316 | 2534.03 |
| 45165.2717 | 2534.03 |
| 45175.5118 | 2533.9 |
| 45185.7519 | 2528.4 |
| 45195.992 | 2528.43 |
| 45206.2321 | 2529.87 |
| 45216.4722 | 2532.18 |
| 45226.7122 | 2512.88 |
| 45236.9523 | 2511.44 |
| 45247.1924 | 2508.69 |
| 45257.4325 | 2508.81 |
| 45267.6726 | 2514.22 |
| 45277.9127 | 2510.19 |
| 45288.1528 | 2514.29 |
| 45298.3928 | 2512.91 |
| 45308.6329 | 2513.07 |
| 45318.873 | 2519.85 |
| 45329.1131 | 2515.7 |
| 45339.3532 | 2514.35 |
| 45349.5933 | 2515.79 |
| 45359.8333 | 2518.54 |
| 45370.0734 | 2518.64 |
| 45380.3135 | 2522.76 |
| 45390.5536 | 2522.83 |
| 45400.7937 | 2525.64 |
| 45411.0338 | 2528.43 |
| 45421.2739 | 2529.9 |
| 45431.5139 | 2534.38 |
| 45441.754 | 2549.6 |
| 45451.9941 | 2553.76 |
| 45462.2342 | 2555.33 |
| 45472.4743 | 2563.59 |
| 45482.7144 | 2564 |
| 45492.9545 | 2582.01 |
| 45503.1945 | 2587.61 |
| 45513.4346 | 2591.74 |
| 45523.6747 | 2591.74 |
| 45533.9148 | 2591.74 |
| 45544.1549 | 2591.74 |
| 45554.395 | 2591.83 |
| 45564.6351 | 2595.93 |
| 45574.8751 | 2594.55 |
| 45585.1152 | 2594.52 |
| 45595.3553 | 2593.18 |
| 45605.5954 | 2594.68 |
| 45615.8355 | 2600.09 |
| 45626.0756 | 2595.96 |
| 45636.3157 | 2595.96 |
| 45646.5557 | 2595.96 |
| 45656.7958 | 2595.99 |
| 45667.0359 | 2597.37 |
| 45677.276 | 2597.46 |
| 45687.5161 | 2601.53 |
| 45697.7562 | 2598.81 |
| 45707.9963 | 2600.18 |
| 45718.2363 | 2600.18 |
| 45728.4764 | 2600.18 |
| 45738.7165 | 2600.22 |
| 45748.9566 | 2601.66 |
| 45759.1967 | 2604.54 |
| 45769.4368 | 2609.91 |
| 45779.6769 | 2604.37 |
| 45789.9169 | 2603.03 |
| 45800.157 | 2604.44 |
| 45810.3971 | 2605.85 |
| 45820.6372 | 2607.25 |
| 45830.8773 | 2608.73 |
| 45841.1174 | 2612.98 |
| 45851.3575 | 2618.39 |
| 45861.5975 | 2614.29 |
| 45871.8376 | 2615.67 |
| 45882.0777 | 2615.76 |
| 45892.3178 | 2620.02 |
| 45902.5579 | 2625.39 |
| 45912.798 | 2619.92 |
| 45923.0381 | 2621.33 |
| 45933.2781 | 2622.74 |
| 45943.5182 | 2624.11 |
| 45953.7583 | 2624.18 |
| 45963.9984 | 2626.96 |
| 45974.2385 | 2628.47 |
| 45984.4786 | 2633.9 |
| 45994.7186 | 2631.15 |
| 46004.9587 | 2631.18 |
| 46015.1988 | 2632.59 |
| 46025.4389 | 2634 |
| 46035.679 | 2635.41 |
| 46045.9191 | 2636.78 |
| 46056.1592 | 2636.85 |
| 46066.3992 | 2639.6 |
| 46076.6393 | 2639.47 |
| 46086.8794 | 2634.1 |
| 46097.1195 | 2639.63 |
| 46107.3596 | 2640.68 |
| 46117.5997 | 2626.8 |
| 46127.8398 | 2621 |
| 46138.0798 | 2608.53 |
| 46148.3199 | 2602.36 |
| 46158.56 | 2517.17 |
| 46168.8001 | 2517.68 |
| 46179.0402 | 2481.88 |
| 46189.2803 | 2479.03 |
| 46199.5204 | 2474.77 |
| 46209.7604 | 2469.08 |
| 46220.0005 | 2460.8 |
| 46230.2406 | 2459.39 |
| 46240.4807 | 2457.87 |
| 46250.7208 | 2451.89 |
| 46260.9609 | 2445.91 |
| 46271.201 | 2439.93 |
| 46281.441 | 2433.89 |
| 46291.6811 | 2425.44 |
| 46301.9212 | 2416.99 |
| 46312.1613 | 2408.55 |
| 46322.4014 | 2400.2 |
| 46332.6415 | 2395.98 |
| 46342.8816 | 2391.76 |
| 46353.1216 | 2387.53 |
| 46363.3617 | 2383.32 |
| 46373.6018 | 2379.38 |
| 46383.8419 | 2375.43 |
| 46394.082 | 2371.49 |
| 46404.3221 | 2367.55 |
| 46414.5622 | 2363.64 |
| 46424.8022 | 2360.82 |
| 46435.0423 | 2358.01 |
| 46445.2824 | 2355.19 |
| 46455.5225 | 2352.37 |
| 46465.7626 | 2349.32 |
| 46476.0027 | 2346.27 |
| 46486.2428 | 2343.22 |
| 46496.4828 | 2340.17 |
| 46506.7229 | 2337.12 |
| 46516.963 | 2334.12 |
| 46527.2031 | 2332.91 |
| 46537.4432 | 2331.7 |
| 46547.6833 | 2330.5 |
| 46557.9234 | 2329.29 |
| 46568.1634 | 2328.08 |
| 46578.4035 | 2326.88 |
| 46588.6436 | 2325.67 |
| 46598.8837 | 2324.55 |
| 46609.1238 | 2323.42 |
| 46619.3639 | 2322.29 |
| 46629.604 | 2321.17 |
| 46639.844 | 2320.07 |
| 46650.0841 | 2320.07 |
| 46660.3242 | 2320.07 |
| 46670.5643 | 2320.07 |
| 46680.8044 | 2320.07 |
| 46691.0445 | 2320.07 |
| 46701.2846 | 2320.11 |
| 46711.5246 | 2321.99 |
| 46721.7647 | 2323.87 |
| 46732.0048 | 2325.74 |
| 46742.2449 | 2327.62 |
| 46752.485 | 2329.5 |
| 46762.7251 | 2331.4 |
| 46772.9652 | 2334.21 |
| 46783.2052 | 2337.03 |
| 46793.4453 | 2339.84 |
| 46803.6854 | 2342.67 |
| 46813.9255 | 2345.83 |
| 46824.1656 | 2349 |
| 46834.4057 | 2352.17 |
| 46844.6457 | 2355.34 |
| 46854.8858 | 2358.5 |
| 46865.1259 | 2361.67 |
| 46875.366 | 2364.84 |
| 46885.6061 | 2368.13 |
| 46895.8462 | 2376.58 |
| 46906.0863 | 2385.06 |
| 46916.3263 | 2394.91 |
| 46926.5664 | 2404.76 |
| 46936.8065 | 2414.57 |
| 46947.0466 | 2422.55 |
| 46957.2867 | 2430.53 |
| 46967.5268 | 2438.51 |
| 46977.7669 | 2446.96 |
| 46988.0069 | 2455.34 |
| 46998.247 | 2460.97 |
| 47008.4871 | 2466.6 |
| 47018.7272 | 2472.33 |
| 47028.9673 | 2482.18 |
| 47039.2074 | 2491.98 |
| 47049.4475 | 2499.49 |
| 47059.6875 | 2507 |
| 47069.9276 | 2514.53 |
| 47080.1677 | 2522.97 |
| 47090.4078 | 2531.41 |
| 47100.6479 | 2539.38 |
| 47110.888 | 2547.36 |
| 47121.1281 | 2555.28 |
| 47131.3681 | 2560.91 |
| 47141.6082 | 2566.54 |
| 47151.8483 | 2572.17 |
| 47162.0884 | 2577.84 |
| 47172.3285 | 2584.87 |
| 47182.5686 | 2591.91 |
| 47192.8087 | 2598.86 |
| 47203.0487 | 2602.38 |
| 47213.2888 | 2605.85 |
| 47223.5289 | 2607.26 |
| 47233.769 | 2608.63 |
| 47244.0091 | 2608.65 |
| 47254.2492 | 2609.35 |
| 47264.4893 | 2610.04 |
| 47274.7293 | 2610.04 |
| 47284.9694 | 2610.04 |
| 47295.2095 | 2610.01 |
| 47305.4496 | 2608.96 |
| 47315.6897 | 2607.9 |
| 47325.9298 | 2606.84 |
| 47336.1699 | 2605.95 |
| 47346.4099 | 2611.03 |
| 47356.65 | 2594.1 |
| 47366.8901 | 2575.76 |
| 47377.1302 | 2556.41 |
| 47387.3703 | 2550.74 |
| 47397.6104 | 2543.98 |
| 47407.8505 | 2547.54 |
| 47418.0905 | 2525.44 |
| 47428.3306 | 2519.88 |
| 47438.5707 | 2516.5 |
| 47448.8108 | 2491.9 |
| 47459.0509 | 2495.98 |
| 47469.291 | 2494.33 |
| 47479.5311 | 2483.25 |
| 47489.7711 | 2479.2 |
| 47500.0112 | 2481.31 |
| 47510.2513 | 2456.29 |
| 47520.4914 | 2442.95 |
| 47530.7315 | 2404.03 |
| 47540.9716 | 2384.25 |
| 47551.2117 | 2362.16 |
| 47561.4517 | 2356.31 |
| 47571.6918 | 2342.73 |
| 47581.9319 | 2347.83 |
| 47592.172 | 2332.6 |
| 47602.4121 | 2326.96 |
| 47612.6522 | 2321.4 |
| 47622.8923 | 2318.63 |
| 47633.1323 | 2317.15 |
| 47643.3724 | 2313.03 |
| 47653.6125 | 2312.92 |
| 47663.8526 | 2308.81 |
| 47674.0927 | 2308.77 |
| 47684.3328 | 2307.4 |
| 47694.5729 | 2307.4 |
| 47704.8129 | 2307.4 |
| 47715.053 | 2307.44 |
| 47725.2931 | 2308.81 |
| 47735.5332 | 2308.88 |
| 47745.7733 | 2311.66 |
| 47756.0134 | 2313.14 |
| 47766.2535 | 2317.4 |
| 47776.4935 | 2322.92 |
| 47786.7336 | 2324.29 |
| 47796.9737 | 2324.43 |
| 47807.2138 | 2330.14 |
| 47817.4539 | 2338.51 |
| 47827.694 | 2344.18 |
| 47837.9341 | 2351.18 |
| 47848.1741 | 2356.74 |
| 47858.4142 | 2359.73 |
| 47868.6543 | 2369.48 |
| 47878.8944 | 2375.47 |
| 47889.1345 | 2394.53 |
| 47899.3746 | 2389.33 |
| 47909.6147 | 2400.45 |
| 47919.8547 | 2406.22 |
| 47930.0948 | 2417.27 |
| 47940.3349 | 2420.08 |
| 47950.575 | 2422.82 |
| 47960.8151 | 2422.75 |
| 47971.0552 | 2420.04 |
| 47981.2953 | 2421.49 |
| 47991.5353 | 2424.3 |
| 48001.7754 | 2427.08 |
| 48012.0155 | 2428.53 |
| 48022.2556 | 2431.31 |
| 48032.4957 | 2432.46 |
| 48042.7358 | 2424.27 |
| 48052.9759 | 2425.46 |
| 48063.2159 | 2418.49 |
| 48073.456 | 2414.38 |
| 48083.6961 | 2414.38 |
| 48093.9362 | 2414.31 |
| 48104.1763 | 2411.56 |
| 48114.4164 | 2411.49 |
| 48124.6565 | 2408.75 |
| 48134.8965 | 2408.75 |
| 48145.1366 | 2408.75 |
| 48155.3767 | 2408.75 |
| 48165.6168 | 2408.75 |
| 48175.8569 | 2408.78 |
| 48186.097 | 2410.25 |
| 48196.3371 | 2414.01 |
| 48206.5771 | 2417.76 |
| 48216.8172 | 2421.51 |
| 48227.0573 | 2425.03 |
| 48237.2974 | 2428.75 |
| 48247.5375 | 2440.01 |
| 48257.7776 | 2451.14 |
| 48268.0177 | 2457.47 |
| 48278.2577 | 2463.97 |
| 48288.4978 | 2476.46 |
| 48298.7379 | 2482.09 |
| 48308.978 | 2487.67 |
| 48319.2181 | 2491.43 |
| 48329.4582 | 2495.18 |
| 48339.6983 | 2498.88 |
| 48349.9383 | 2500.76 |
| 48360.1784 | 2502.64 |
| 48370.4185 | 2504.59 |
| 48380.6586 | 2509.28 |
| 48390.8987 | 2513.97 |
| 48401.1388 | 2518.63 |
| 48411.3789 | 2522.15 |
| 48421.6189 | 2525.67 |
| 48431.859 | 2529.19 |
| 48442.0991 | 2532.77 |
| 48452.3392 | 2538.4 |
| 48462.5793 | 2544.03 |
| 48472.8194 | 2549.64 |
| 48483.0595 | 2554.57 |
| 48493.2995 | 2559.47 |
| 48503.5396 | 2563.7 |
| 48513.7797 | 2568.07 |
| 48524.0198 | 2577.92 |
| 48534.2599 | 2587.63 |
| 48544.5 | 2591.85 |
| 48554.7401 | 2596.18 |
| 48564.9801 | 2604.63 |
| 48575.2202 | 2613.12 |
| 48585.4603 | 2623.45 |
| 48595.7004 | 2633.77 |
| 48605.9405 | 2644.06 |
| 48616.1806 | 2653.21 |
| 48626.4207 | 2662.16 |
| 48636.6607 | 2663.56 |
| 48646.9008 | 2664.97 |
| 48657.1409 | 2666.38 |
| 48667.381 | 2667.79 |
| 48677.6211 | 2669.13 |
| 48687.8612 | 2668.07 |
| 48698.1013 | 2667.02 |
| 48708.3413 | 2665.96 |
| 48718.5814 | 2664.9 |
| 48728.8215 | 2663.49 |
| 48739.0616 | 2662.08 |
| 48749.3017 | 2660.67 |
| 48759.5418 | 2659.27 |
| 48769.7819 | 2657.71 |
| 48780.0219 | 2651.01 |
| 48790.262 | 2656.53 |
| 48800.5021 | 2657.86 |
| 48810.7422 | 2656.41 |
| 48820.9823 | 2653.49 |
| 48831.2224 | 2646.67 |
| 48841.4625 | 2647.89 |
| 48851.7025 | 2642.34 |
| 48861.9426 | 2639.56 |
| 48872.1827 | 2638.15 |
| 48882.4228 | 2636.78 |
| 48892.6629 | 2636.78 |
| 48902.903 | 2636.67 |
| 48913.1431 | 2632.45 |
| 48923.3831 | 2628.19 |
| 48933.6232 | 2622.67 |
| 48943.8633 | 2621.22 |
| 48954.1034 | 2618.48 |
| 48964.3435 | 2618.44 |
| 48974.5836 | 2617.19 |
| 48984.8237 | 2621.26 |
| 48995.0637 | 2619.89 |
| 49005.3038 | 2619.25 |
| 49015.5439 | 2596.11 |
| 49025.784 | 2601.74 |
| 49036.0241 | 2607.15 |
| 49046.2642 | 2604.26 |
| 49056.5043 | 2598.7 |
| 49066.7443 | 2595.89 |
| 49076.9844 | 2593.07 |
| 49087.2245 | 2589.91 |
| 49097.4646 | 2574.96 |
| 49107.7047 | 2579.18 |
| 49117.9448 | 2583.25 |
| 49128.1849 | 2581.96 |
| 49138.4249 | 2584.59 |
| 49148.665 | 2580.33 |
| 49158.9051 | 2574.73 |
| 49169.1452 | 2570.59 |
| 49179.3853 | 2569.1 |
| 49189.6254 | 2564.92 |
| 49199.8655 | 2561.72 |
| 49210.1055 | 2545.25 |
| 49220.3456 | 2543.88 |
| 49230.5857 | 2543.84 |
| 49240.8258 | 2542.47 |
| 49251.0659 | 2542.59 |
| 49261.306 | 2546.77 |
| 49271.5461 | 2549.39 |
| 49281.7861 | 2545.25 |
| 49292.0262 | 2543.73 |
| 49302.2663 | 2538.21 |
| 49312.5064 | 2536.53 |
| 49322.7465 | 2525.5 |
| 49332.9866 | 2522.69 |
| 49343.2267 | 2520.03 |
| 49353.4667 | 2522.61 |
| 49363.7068 | 2517.13 |
| 49373.9469 | 2517.02 |
| 49384.187 | 2512.87 |
| 49394.4271 | 2511.35 |
| 49404.6672 | 2505.87 |
| 49414.9073 | 2505.91 |
| 49425.1474 | 2506.86 |
| 49435.3874 | 2491.76 |
| 49445.6275 | 2490.39 |
| 49455.8676 | 2490.12 |
| 49466.1077 | 2480.61 |
| 49476.3478 | 2483 |
| 49486.5879 | 2470.64 |
| 49496.828 | 2469.24 |
| 49507.068 | 2467.37 |
| 49517.3081 | 2449.49 |
| 49527.5482 | 2446.71 |
| 49537.7883 | 2445.35 |
| 49548.0284 | 2445.35 |
| 49558.2685 | 2444.88 |
| 49568.5086 | 2427.95 |
| 49578.7486 | 2408.88 |
| 49588.9887 | 2363.63 |
| 49599.2288 | 2360.08 |
| 49609.4689 | 2331.17 |
| 49619.709 | 2325.7 |
| 49629.9491 | 2324.88 |
| 49640.1892 | 2296.02 |
| 49650.4292 | 2291.76 |
| 49660.6693 | 2286.21 |
| 49670.9094 | 2283.47 |
| 49681.1495 | 2283.35 |
| 49691.3896 | 2279.25 |
| 49701.6297 | 2279.13 |
| 49711.8698 | 2274.91 |
| 49722.1098 | 2270.72 |
| 49732.3499 | 2267.95 |
| 49742.59 | 2266.54 |
| 49752.8301 | 2265.09 |
| 49763.0702 | 2262.36 |
| 49773.3103 | 2262.36 |
| 49783.5504 | 2262.36 |
| 49793.7904 | 2262.36 |
| 49804.0305 | 2262.43 |
| 49814.2706 | 2265.17 |
| 49824.5107 | 2265.21 |
| 49834.7508 | 2266.58 |
| 49844.9909 | 2266.74 |
| 49855.231 | 2272.17 |
| 49865.471 | 2270.8 |
| 49875.7111 | 2270.92 |
| 49885.9512 | 2274.95 |
| 49896.1913 | 2272.25 |
| 49906.4314 | 2273.73 |
| 49916.6715 | 2278.47 |
| 49926.9116 | 2300.2 |
| 49937.1516 | 2294.85 |
| 49947.3917 | 2299.11 |
| 49957.6318 | 2304.7 |
| 49967.8719 | 2308.73 |
| 49978.112 | 2306.07 |
| 49988.3521 | 2309.16 |
| 49998.5922 | 2321.55 |
| 50008.8322 | 2324.37 |
| 50019.0723 | 2327.82 |
| 50029.3124 | 2352.88 |
| 50039.5525 | 2367.93 |
| 50049.7926 | 2369.62 |
| 50060.0327 | 2428.45 |
| 50070.2728 | 2428.53 |
| 50080.5128 | 2431.51 |
| 50090.7529 | 2439.87 |
| 50100.993 | 2445.86 |
| 50111.2331 | 2463.68 |
| 50121.4732 | 2465.21 |
| 50131.7133 | 2470.84 |
| 50141.9534 | 2476 |
| 50152.1934 | 2464.95 |
| 50162.4335 | 2461.43 |
| 50172.6736 | 2457.92 |
| 50182.9137 | 2454.4 |
| 50193.1538 | 2450.88 |
| 50203.3939 | 2447.36 |
| 50213.634 | 2443.83 |
| 50223.874 | 2439.79 |
| 50234.1141 | 2432.66 |
| 50244.3542 | 2432 |
| 50254.5943 | 2428.06 |
| 50264.8344 | 2424.14 |
| 50275.0745 | 2420.88 |
| 50285.3146 | 2418.48 |
| 50295.5547 | 2414.34 |
| 50305.7947 | 2412.93 |
| 50316.0348 | 2411.52 |
| 50326.2749 | 2410.08 |
| 50336.515 | 2407.34 |
| 50346.7551 | 2407.3 |
| 50356.9952 | 2405.94 |
| 50367.2353 | 2406.29 |
| 50377.4753 | 2406.65 |
| 50387.7154 | 2407 |
| 50397.9555 | 2407.37 |
| 50408.1956 | 2408.31 |
| 50418.4357 | 2409.24 |
| 50428.6758 | 2410.18 |
| 50438.9159 | 2411.12 |
| 50449.1559 | 2412.06 |
| 50459.396 | 2413.04 |
| 50469.6361 | 2415.38 |
| 50479.8762 | 2417.73 |
| 50490.1163 | 2420.29 |
| 50500.3564 | 2429.96 |
| 50510.5965 | 2433.24 |
| 50520.8365 | 2436.52 |
| 50531.0766 | 2439.98 |
| 50541.3167 | 2449.13 |
| 50551.5568 | 2458.08 |
| 50561.7969 | 2460.43 |
| 50572.037 | 2462.77 |
| 50582.2771 | 2465.24 |
| 50592.5171 | 2471.81 |
| 50602.7572 | 2478.38 |
| 50612.9973 | 2485.41 |
| 50623.2374 | 2507.36 |
| 50633.4775 | 2510.18 |
| 50643.7176 | 2512.99 |
| 50653.9577 | 2515.81 |
| 50664.1977 | 2518.54 |
| 50674.4378 | 2518.58 |
| 50684.6779 | 2520.07 |
| 50694.918 | 2524.17 |
| 50705.1581 | 2524.17 |
| 50715.3982 | 2524.13 |
| 50725.6383 | 2522.81 |
| 50735.8783 | 2524.21 |
| 50746.1184 | 2525.74 |
| 50756.3585 | 2531.05 |
| 50766.5986 | 2525.58 |
| 50776.8387 | 2525.74 |
| 50787.0788 | 2531.21 |
| 50797.3189 | 2531.21 |
| 50807.5589 | 2531.21 |
| 50817.799 | 2531.21 |
| 50828.0391 | 2531.17 |
| 50838.2792 | 2529.97 |
| 50848.5193 | 2535.43 |
| 50858.7594 | 2534.98 |
| 50868.9995 | 2520.19 |
| 50879.2395 | 2528.11 |
| 50889.4796 | 2518.66 |
| 50899.7197 | 2522.72 |
| 50909.9598 | 2521.15 |
| 50920.1999 | 2514.28 |
| 50930.44 | 2512.99 |
| 50940.6801 | 2515.69 |
| 50950.9202 | 2514.2 |
| 50961.1602 | 2510.01 |
| 50971.4003 | 2507.2 |
| 50981.6404 | 2504.42 |
| 50991.8805 | 2503.14 |
| 51002.1206 | 2505.87 |
| 51012.3607 | 2505.71 |
| 51022.6008 | 2500.24 |
| 51032.8408 | 2500.2 |
| 51043.0809 | 2498.79 |
| 51053.321 | 2497.51 |
| 51063.5611 | 2500.24 |
| 51073.8012 | 2500.24 |
| 51084.0413 | 2500.49 |
| 51094.2814 | 2508.69 |
| 51104.5214 | 2508.52 |
| 51114.7615 | 2503.02 |
| 51125.0016 | 2501.61 |
| 51135.2417 | 2500.16 |
| 51145.4818 | 2497.39 |
| 51155.7219 | 2495.98 |
| 51165.962 | 2494.53 |
| 51176.202 | 2491.8 |
| 51186.4421 | 2491.8 |
| 51196.6822 | 2491.76 |
| 51206.9223 | 2490.39 |
| 51217.1624 | 2490.39 |
| 51227.4025 | 2490.39 |
| 51237.6426 | 2490.43 |
| 51247.8826 | 2491.84 |
| 51258.1227 | 2493.29 |
| 51268.3628 | 2496.06 |
| 51278.6029 | 2497.47 |
| 51288.843 | 2499.17 |
| 51299.0831 | 2510.1 |
| 51309.3232 | 2510.1 |
| 51319.5632 | 2510.1 |
| 51329.8033 | 2510.39 |
| 51340.0434 | 2519.95 |
| 51350.2835 | 2519.99 |
| 51360.5236 | 2521.36 |
| 51370.7637 | 2521.36 |
| 51381.0038 | 2521.44 |
| 51391.2438 | 2524.21 |
| 51401.4839 | 2526 |
| 51411.724 | 2539.66 |
| 51421.9641 | 2539.7 |
| 51432.2042 | 2541.06 |
| 51442.4443 | 2541.06 |
| 51452.6844 | 2541.11 |
| 51462.9245 | 2542.51 |
| 51473.1645 | 2543.88 |
| 51483.4046 | 2544.3 |
| 51493.6447 | 2557.96 |
| 51503.8848 | 2558.12 |
| 51514.1249 | 2563.5 |
| 51524.365 | 2560.85 |
| 51534.6051 | 2563.84 |
| 51544.8451 | 2572.03 |
| 51555.0852 | 2572.03 |
| 51565.3253 | 2572.2 |
| 51575.5654 | 2577.75 |
| 51585.8055 | 2580.48 |
| 51596.0456 | 2580.43 |
| 51606.2857 | 2578.77 |
| 51616.5257 | 2569.09 |
| 51626.7658 | 2564.99 |
| 51637.0059 | 2564.95 |
| 51647.246 | 2563.59 |
| 51657.4861 | 2563.37 |
| 51667.7262 | 2556.38 |
| 51677.9663 | 2550.87 |
| 51688.2063 | 2549.38 |
| 51698.4464 | 2545.29 |
| 51708.6865 | 2545.2 |
| 51718.9266 | 2542.6 |
| 51729.1667 | 2546.44 |
| 51739.4068 | 2538.21 |
| 51749.6469 | 2536.84 |
| 51759.8869 | 2536.8 |
| 51770.127 | 2535.26 |
| 51780.3671 | 2529.68 |
| 51790.6072 | 2525.54 |
| 51800.8473 | 2524.09 |
| 51811.0874 | 2521.19 |
| 51821.3275 | 2515.68 |
| 51831.5676 | 2514.28 |
| 51841.8076 | 2513.08 |
| 51852.0477 | 2518.37 |
| 51862.2878 | 2512.74 |
| 51872.5279 | 2507.32 |
| 51882.768 | 2508.6 |
| 51893.0081 | 2505.79 |
| 51903.2482 | 2503.06 |
| 51913.4882 | 2502.93 |
| 51923.7283 | 2498.71 |
| 51933.9684 | 2494.44 |
| 51944.2085 | 2488.92 |
| 51954.4486 | 2486.81 |
| 51964.6887 | 2484.7 |
| 51974.9288 | 2482.58 |
| 51985.1688 | 2480.47 |
| 51995.4089 | 2478.36 |
| 52005.649 | 2476.23 |
| 52015.8891 | 2473.41 |
| 52026.1292 | 2470.64 |
| 52036.3693 | 2469.23 |
| 52046.6094 | 2467.82 |
| 52056.8494 | 2466.43 |
| 52067.0895 | 2465.59 |
| 52077.3296 | 2464.75 |
| 52087.5697 | 2463.9 |
| 52097.8098 | 2463.06 |
| 52108.0499 | 2462.12 |
| 52118.29 | 2458.37 |
| 52128.53 | 2454.62 |
| 52138.7701 | 2450.86 |
| 52149.0102 | 2447.11 |
| 52159.2503 | 2443.35 |
| 52169.4904 | 2439.59 |
| 52179.7305 | 2435.36 |
| 52189.9706 | 2431.24 |
| 52200.2106 | 2430.3 |
| 52210.4507 | 2429.36 |
| 52220.6908 | 2428.45 |
| 52230.9309 | 2428.45 |
| 52241.171 | 2428.45 |
| 52251.4111 | 2428.41 |
| 52261.6512 | 2427 |
| 52271.8913 | 2425.6 |
| 52282.1313 | 2423.97 |
| 52292.3714 | 2415.69 |
| 52302.6115 | 2412.4 |
| 52312.8516 | 2409.12 |
| 52323.0917 | 2405.85 |
| 52333.3318 | 2403.03 |
| 52343.5719 | 2400.39 |
| 52353.8119 | 2403.12 |
| 52364.052 | 2402.51 |
| 52374.2921 | 2383.41 |
| 52384.5322 | 2383.41 |
| 52394.7723 | 2383.38 |
| 52405.0124 | 2382.25 |
| 52415.2525 | 2381.12 |
| 52425.4925 | 2380 |
| 52435.7326 | 2378.87 |
| 52445.9727 | 2377.71 |
| 52456.2128 | 2375.36 |
| 52466.4529 | 2373.02 |
| 52476.693 | 2370.72 |
| 52486.9331 | 2370.02 |
| 52497.1731 | 2369.31 |
| 52507.4132 | 2368.61 |
| 52517.6533 | 2367.78 |
| 52527.8934 | 2363.09 |
| 52538.1335 | 2358.4 |
| 52548.3736 | 2353.37 |
| 52558.6137 | 2337.78 |
| 52568.8537 | 2318.77 |
| 52579.0938 | 2300.28 |
| 52589.3339 | 2297.62 |
| 52599.574 | 2294.96 |
| 52609.8141 | 2292.3 |
| 52620.0542 | 2289.64 |
| 52630.2943 | 2286.98 |
| 52640.5344 | 2284.33 |
| 52650.7744 | 2281.67 |
| 52661.0145 | 2279.01 |
| 52671.2546 | 2276.34 |
| 52681.4947 | 2273.53 |
| 52691.7348 | 2270.71 |
| 52701.9749 | 2267.99 |
| 52712.215 | 2268.07 |
| 52722.455 | 2270.89 |
| 52732.6951 | 2273.62 |
| 52742.9352 | 2273.75 |
| 52753.1753 | 2278.03 |
| 52763.4154 | 2284.27 |
| 52773.6555 | 2290.5 |
| 52783.8956 | 2296.74 |
| 52794.1356 | 2302.97 |
| 52804.3757 | 2309.2 |
| 52814.6158 | 2315.44 |
| 52824.8559 | 2321.65 |
| 52835.096 | 2327.5 |
| 52845.3361 | 2339.64 |
| 52855.5762 | 2335.73 |
| 52865.8162 | 2341.49 |
| 52876.0563 | 2351.21 |
| 52886.2964 | 2357.2 |
| 52896.5365 | 2373.6 |
| 52906.7766 | 2375.1 |
| 52917.0167 | 2379.32 |
| 52927.2568 | 2384.12 |
| 52937.4969 | 2406.03 |
| 52947.7369 | 2409.2 |
| 52957.977 | 2412.37 |
| 52968.2171 | 2415.53 |
| 52978.4572 | 2418.6 |
| 52988.6973 | 2418.6 |
| 52998.9374 | 2418.6 |
| 53009.1775 | 2418.6 |
| 53019.4175 | 2418.6 |
| 53029.6576 | 2418.62 |
| 53039.8977 | 2419.09 |
| 53050.1378 | 2419.55 |
| 53060.3779 | 2419.94 |
| 53070.618 | 2417.83 |
| 53080.8581 | 2415.7 |
| 53091.0981 | 2412.88 |
| 53101.3382 | 2410.04 |
| 53111.5783 | 2406.52 |
| 53121.8184 | 2402.87 |
| 53132.0585 | 2395.13 |
| 53142.2986 | 2387.5 |
| 53152.5387 | 2383.12 |
| 53162.7787 | 2373.97 |
| 53173.0188 | 2364.99 |
| 53183.2589 | 2361.12 |
| 53193.499 | 2357.25 |
| 53203.7391 | 2353.38 |
| 53213.9792 | 2349.58 |
| 53224.2193 | 2348.18 |
| 53234.4594 | 2346.77 |
| 53244.6994 | 2345.36 |
| 53254.9395 | 2344 |
| 53265.1796 | 2344 |
| 53275.4197 | 2344 |
| 53285.6598 | 2344 |
| 53295.8999 | 2344 |
| 53306.14 | 2344.06 |
| 53316.38 | 2346.18 |
| 53326.6201 | 2348.29 |
| 53336.8602 | 2350.4 |
| 53347.1003 | 2352.53 |
| 53357.3404 | 2355.35 |
| 53367.5805 | 2358.16 |
| 53377.8206 | 2361 |
| 53388.0606 | 2364.52 |
| 53398.3007 | 2368.04 |
| 53408.5408 | 2371.56 |
| 53418.7809 | 2375.15 |
| 53429.021 | 2380.78 |
| 53439.2611 | 2386.72 |
| 53449.5012 | 2402 |
| 53459.7412 | 2411.15 |
| 53469.9813 | 2420.19 |
| 53480.2214 | 2425.82 |
| 53490.4615 | 2431.45 |
| 53500.7016 | 2437.08 |
| 53510.9417 | 2442.71 |
| 53521.1818 | 2448.34 |
| 53531.4219 | 2454.14 |
| 53541.6619 | 2464.93 |
| 53551.902 | 2475.72 |
| 53562.1421 | 2486.48 |
| 53572.3822 | 2496.34 |
| 53582.6223 | 2506.17 |
| 53592.8624 | 2515.32 |
| 53603.1025 | 2524.32 |
| 53613.3425 | 2529.02 |
| 53623.5826 | 2533.71 |
| 53633.8227 | 2538.41 |
| 53644.0628 | 2543.33 |
| 53654.3029 | 2548.83 |
| 53664.543 | 2571.22 |
| 53674.7831 | 2588.95 |
| 53685.0231 | 2589.65 |
| 53695.2632 | 2590.28 |
| 53705.5033 | 2588.88 |
| 53715.7434 | 2587.47 |
| 53725.9835 | 2586.06 |
| 53736.2236 | 2584.7 |
| 53746.4637 | 2584.7 |
| 53756.7037 | 2584.7 |
| 53766.9438 | 2584.7 |
| 53777.1839 | 2584.77 |
| 53787.424 | 2586.88 |
| 53797.6641 | 2588.95 |
| 53807.9042 | 2589.65 |
| 53818.1443 | 2590.51 |
| 53828.3844 | 2596.16 |
| 53837.9108 | 2601.59 |